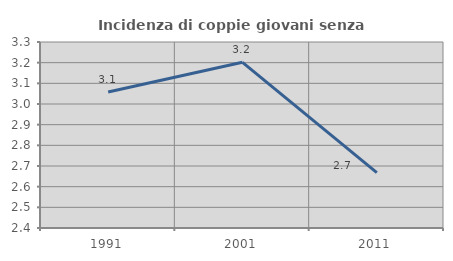
| Category | Incidenza di coppie giovani senza figli |
|---|---|
| 1991.0 | 3.058 |
| 2001.0 | 3.202 |
| 2011.0 | 2.668 |